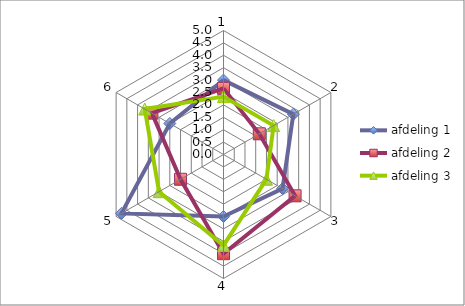
| Category | afdeling 1 | afdeling 2 | afdeling 3 |
|---|---|---|---|
| 0 | 3 | 2.667 | 2.333 |
| 1 | 3.25 | 1.667 | 2.333 |
| 2 | 2.75 | 3.333 | 2 |
| 3 | 2.5 | 4 | 3.667 |
| 4 | 4.75 | 2 | 3 |
| 5 | 2.5 | 3.333 | 3.667 |